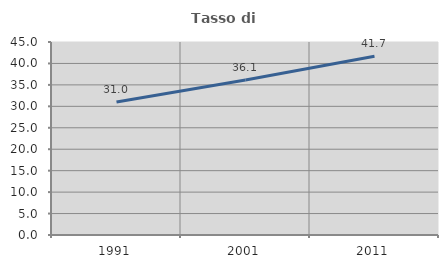
| Category | Tasso di occupazione   |
|---|---|
| 1991.0 | 31.033 |
| 2001.0 | 36.122 |
| 2011.0 | 41.677 |